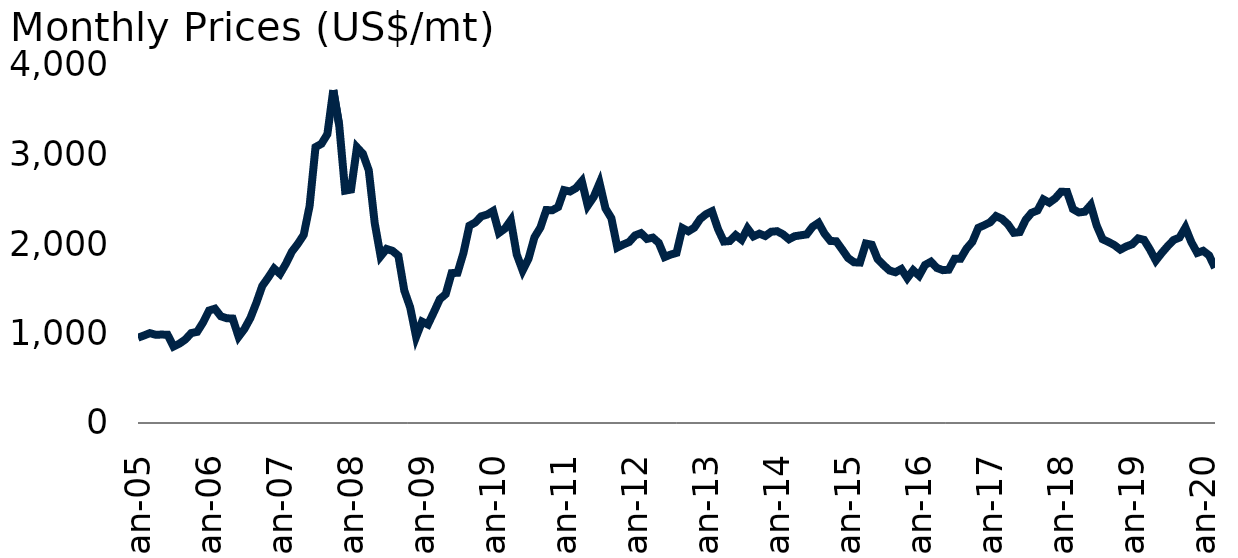
| Category | Lead |
|---|---|
| 2005-01-01 | 953.15 |
| 2005-02-01 | 977.55 |
| 2005-03-01 | 1004 |
| 2005-04-01 | 985.762 |
| 2005-05-01 | 988.075 |
| 2005-06-01 | 986.068 |
| 2005-07-01 | 854.476 |
| 2005-08-01 | 887.023 |
| 2005-09-01 | 933.068 |
| 2005-10-01 | 1004.762 |
| 2005-11-01 | 1018.409 |
| 2005-12-01 | 1124.075 |
| 2006-01-01 | 1256.333 |
| 2006-02-01 | 1277.05 |
| 2006-03-01 | 1192.087 |
| 2006-04-01 | 1170.417 |
| 2006-05-01 | 1166.857 |
| 2006-06-01 | 963.864 |
| 2006-07-01 | 1052.381 |
| 2006-08-01 | 1174.136 |
| 2006-09-01 | 1342.381 |
| 2006-10-01 | 1531.136 |
| 2006-11-01 | 1624.523 |
| 2006-12-01 | 1725.5 |
| 2007-01-01 | 1666.091 |
| 2007-02-01 | 1779.6 |
| 2007-03-01 | 1914.045 |
| 2007-04-01 | 2000.947 |
| 2007-05-01 | 2101.25 |
| 2007-06-01 | 2425.2 |
| 2007-07-01 | 3082.76 |
| 2007-08-01 | 3119.455 |
| 2007-09-01 | 3226.55 |
| 2007-10-01 | 3719.717 |
| 2007-11-01 | 3328.182 |
| 2007-12-01 | 2596.028 |
| 2008-01-01 | 2608.136 |
| 2008-02-01 | 3079.881 |
| 2008-03-01 | 3008.579 |
| 2008-04-01 | 2822.75 |
| 2008-05-01 | 2234.625 |
| 2008-06-01 | 1863.048 |
| 2008-07-01 | 1944.913 |
| 2008-08-01 | 1923.575 |
| 2008-09-01 | 1868.364 |
| 2008-10-01 | 1480.109 |
| 2008-11-01 | 1291.1 |
| 2008-12-01 | 962.881 |
| 2009-01-01 | 1132.738 |
| 2009-02-01 | 1100.525 |
| 2009-03-01 | 1238.909 |
| 2009-04-01 | 1383.1 |
| 2009-05-01 | 1440.158 |
| 2009-06-01 | 1674.455 |
| 2009-07-01 | 1678.609 |
| 2009-08-01 | 1900.1 |
| 2009-09-01 | 2204.545 |
| 2009-10-01 | 2240.773 |
| 2009-11-01 | 2308.762 |
| 2009-12-01 | 2328.524 |
| 2010-01-01 | 2368.375 |
| 2010-02-01 | 2123.675 |
| 2010-03-01 | 2172.087 |
| 2010-04-01 | 2264.85 |
| 2010-05-01 | 1882.684 |
| 2010-06-01 | 1703.955 |
| 2010-07-01 | 1836.977 |
| 2010-08-01 | 2075.238 |
| 2010-09-01 | 2184.227 |
| 2010-10-01 | 2379.667 |
| 2010-11-01 | 2376.727 |
| 2010-12-01 | 2412.929 |
| 2011-01-01 | 2601.65 |
| 2011-02-01 | 2586.675 |
| 2011-03-01 | 2624.02 |
| 2011-04-01 | 2701.17 |
| 2011-05-01 | 2428.32 |
| 2011-06-01 | 2524.99 |
| 2011-07-01 | 2681.02 |
| 2011-08-01 | 2397.28 |
| 2011-09-01 | 2287.67 |
| 2011-10-01 | 1960.38 |
| 2011-11-01 | 1994.22 |
| 2011-12-01 | 2022.35 |
| 2012-01-01 | 2096.16 |
| 2012-02-01 | 2121.26 |
| 2012-03-01 | 2056.69 |
| 2012-04-01 | 2071.07 |
| 2012-05-01 | 2012.821 |
| 2012-06-01 | 1854.152 |
| 2012-07-01 | 1881.477 |
| 2012-08-01 | 1900.62 |
| 2012-09-01 | 2177.67 |
| 2012-10-01 | 2141.97 |
| 2012-11-01 | 2181.966 |
| 2012-12-01 | 2279.803 |
| 2013-01-01 | 2333.68 |
| 2013-02-01 | 2365.788 |
| 2013-03-01 | 2169.417 |
| 2013-04-01 | 2027.386 |
| 2013-05-01 | 2032.978 |
| 2013-06-01 | 2099.688 |
| 2013-07-01 | 2047.728 |
| 2013-08-01 | 2174.182 |
| 2013-09-01 | 2084.919 |
| 2013-10-01 | 2115.428 |
| 2013-11-01 | 2089.56 |
| 2013-12-01 | 2136.728 |
| 2014-01-01 | 2143.17 |
| 2014-02-01 | 2108.03 |
| 2014-03-01 | 2053.08 |
| 2014-04-01 | 2087.09 |
| 2014-05-01 | 2097.32 |
| 2014-06-01 | 2106.94 |
| 2014-07-01 | 2193.24 |
| 2014-08-01 | 2236.84 |
| 2014-09-01 | 2117.24 |
| 2014-10-01 | 2034.26 |
| 2014-11-01 | 2030.18 |
| 2014-12-01 | 1938.11 |
| 2015-01-01 | 1843.13 |
| 2015-02-01 | 1795.66 |
| 2015-03-01 | 1792.47 |
| 2015-04-01 | 2005.36 |
| 2015-05-01 | 1991.78 |
| 2015-06-01 | 1829.5 |
| 2015-07-01 | 1763.04 |
| 2015-08-01 | 1703.6 |
| 2015-09-01 | 1684.25 |
| 2015-10-01 | 1720.11 |
| 2015-11-01 | 1618.35 |
| 2015-12-01 | 1706.58 |
| 2016-01-01 | 1646.2 |
| 2016-02-01 | 1765.75 |
| 2016-03-01 | 1802.19 |
| 2016-04-01 | 1732.27 |
| 2016-05-01 | 1707.8 |
| 2016-06-01 | 1712.77 |
| 2016-07-01 | 1834.79 |
| 2016-08-01 | 1835.52 |
| 2016-09-01 | 1947.64 |
| 2016-10-01 | 2024.49 |
| 2016-11-01 | 2180.58 |
| 2016-12-01 | 2209.84 |
| 2017-01-01 | 2242.62 |
| 2017-02-01 | 2311.5 |
| 2017-03-01 | 2280.92 |
| 2017-04-01 | 2220.61 |
| 2017-05-01 | 2125.11 |
| 2017-06-01 | 2132.93 |
| 2017-07-01 | 2269.86 |
| 2017-08-01 | 2348.47 |
| 2017-09-01 | 2374.39 |
| 2017-10-01 | 2498.22 |
| 2017-11-01 | 2461.43 |
| 2017-12-01 | 2509.92 |
| 2018-01-01 | 2584.09 |
| 2018-02-01 | 2581.06 |
| 2018-03-01 | 2390 |
| 2018-04-01 | 2352.41 |
| 2018-05-01 | 2360.93 |
| 2018-06-01 | 2436.29 |
| 2018-07-01 | 2207.02 |
| 2018-08-01 | 2053.53 |
| 2018-09-01 | 2022.91 |
| 2018-10-01 | 1987.55 |
| 2018-11-01 | 1937.11 |
| 2018-12-01 | 1972.32 |
| 2019-01-01 | 1997.14 |
| 2019-02-01 | 2062.79 |
| 2019-03-01 | 2046.46 |
| 2019-04-01 | 1938.99 |
| 2019-05-01 | 1815.19 |
| 2019-06-01 | 1899.7 |
| 2019-07-01 | 1975.64 |
| 2019-08-01 | 2044.55 |
| 2019-09-01 | 2071.85 |
| 2019-10-01 | 2184.09 |
| 2019-11-01 | 2021.15 |
| 2019-12-01 | 1900.54 |
| 2020-01-01 | 1923.93 |
| 2020-02-01 | 1872.54 |
| 2020-03-01 | 1734.44 |